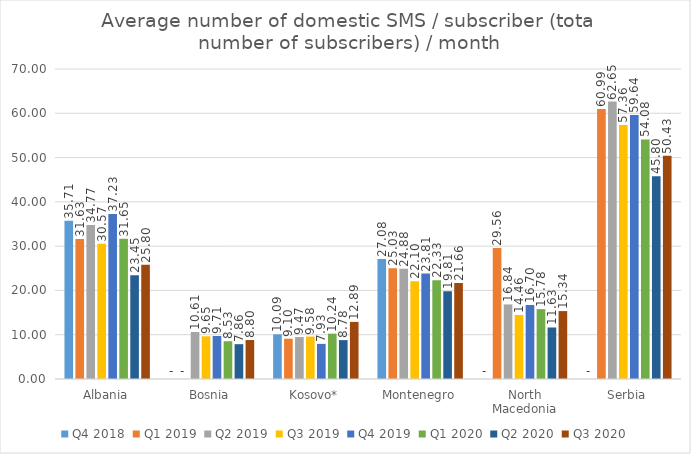
| Category | Q4 2018 | Q1 2019 | Q2 2019 | Q3 2019 | Q4 2019 | Q1 2020 | Q2 2020 | Q3 2020 |
|---|---|---|---|---|---|---|---|---|
| Albania | 35.712 | 31.631 | 34.767 | 30.568 | 37.231 | 31.647 | 23.454 | 25.8 |
| Bosnia | 0 | 0 | 10.606 | 9.648 | 9.705 | 8.527 | 7.863 | 8.796 |
| Kosovo* | 10.09 | 9.101 | 9.471 | 9.581 | 7.93 | 10.24 | 8.782 | 12.893 |
| Montenegro | 27.084 | 25.033 | 24.877 | 22.097 | 23.815 | 22.326 | 19.808 | 21.661 |
| North Macedonia | 0 | 29.561 | 16.837 | 14.462 | 16.703 | 15.777 | 11.633 | 15.336 |
| Serbia | 0 | 60.986 | 62.65 | 57.364 | 59.637 | 54.084 | 45.798 | 50.427 |